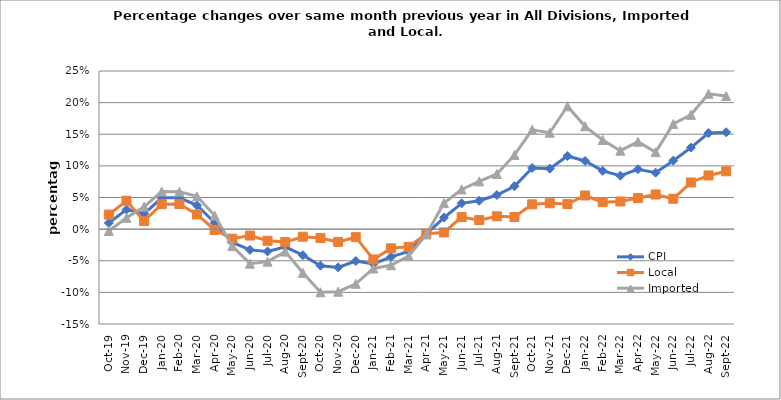
| Category | CPI | Local | Imported |
|---|---|---|---|
| 2019-10-01 | 0.01 | 0.023 | -0.003 |
| 2019-11-01 | 0.031 | 0.045 | 0.018 |
| 2019-12-01 | 0.024 | 0.013 | 0.035 |
| 2020-01-01 | 0.049 | 0.039 | 0.059 |
| 2020-02-01 | 0.05 | 0.04 | 0.059 |
| 2020-03-01 | 0.038 | 0.023 | 0.052 |
| 2020-04-01 | 0.01 | -0.001 | 0.021 |
| 2020-05-01 | -0.021 | -0.015 | -0.027 |
| 2020-06-01 | -0.033 | -0.01 | -0.055 |
| 2020-07-01 | -0.035 | -0.018 | -0.051 |
| 2020-08-01 | -0.028 | -0.02 | -0.036 |
| 2020-09-01 | -0.041 | -0.012 | -0.069 |
| 2020-10-01 | -0.058 | -0.014 | -0.1 |
| 2020-11-01 | -0.06 | -0.02 | -0.099 |
| 2020-12-01 | -0.05 | -0.013 | -0.086 |
| 2021-01-01 | -0.055 | -0.048 | -0.062 |
| 2021-02-01 | -0.044 | -0.03 | -0.057 |
| 2021-03-01 | -0.035 | -0.028 | -0.043 |
| 2021-04-01 | -0.008 | -0.007 | -0.008 |
| 2021-05-01 | 0.018 | -0.005 | 0.041 |
| 2021-06-01 | 0.041 | 0.019 | 0.063 |
| 2021-07-01 | 0.045 | 0.014 | 0.075 |
| 2021-08-01 | 0.054 | 0.02 | 0.087 |
| 2021-09-01 | 0.068 | 0.019 | 0.117 |
| 2021-10-01 | 0.097 | 0.039 | 0.157 |
| 2021-11-01 | 0.096 | 0.041 | 0.152 |
| 2021-12-01 | 0.116 | 0.04 | 0.194 |
| 2022-01-01 | 0.108 | 0.053 | 0.163 |
| 2022-02-01 | 0.092 | 0.043 | 0.141 |
| 2022-03-01 | 0.085 | 0.044 | 0.124 |
| 2022-04-01 | 0.095 | 0.049 | 0.138 |
| 2022-05-01 | 0.089 | 0.055 | 0.122 |
| 2022-06-01 | 0.108 | 0.048 | 0.166 |
| 2022-07-01 | 0.129 | 0.074 | 0.181 |
| 2022-08-01 | 0.152 | 0.085 | 0.214 |
| 2022-09-01 | 0.153 | 0.091 | 0.21 |